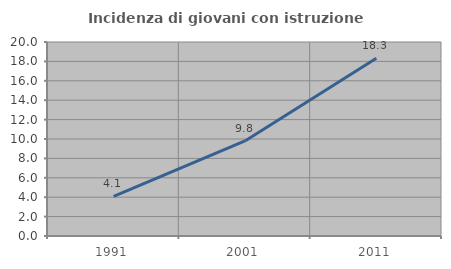
| Category | Incidenza di giovani con istruzione universitaria |
|---|---|
| 1991.0 | 4.075 |
| 2001.0 | 9.799 |
| 2011.0 | 18.323 |